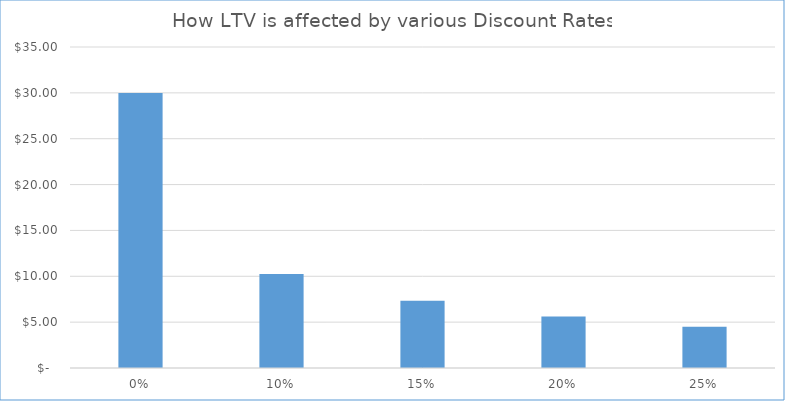
| Category | LTV |
|---|---|
| 0.0 | 29.998 |
| 0.1 | 10.249 |
| 0.15 | 7.333 |
| 0.2 | 5.612 |
| 0.25 | 4.497 |